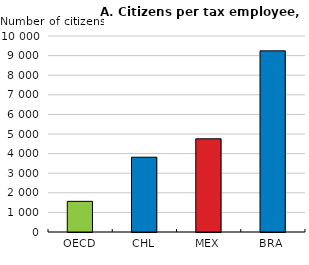
| Category | No. of citizens per FTE in tax administration (tax and non-tax related roles, excluding customs) |
|---|---|
| OECD | 1563.467 |
| CHL | 3814.687 |
| MEX | 4754.527 |
| BRA | 9241.363 |